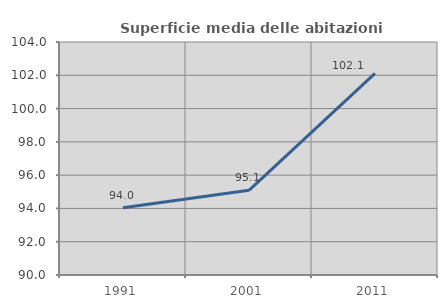
| Category | Superficie media delle abitazioni occupate |
|---|---|
| 1991.0 | 94.039 |
| 2001.0 | 95.089 |
| 2011.0 | 102.112 |